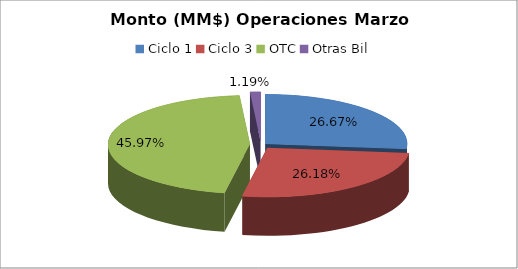
| Category | Series 0 |
|---|---|
| Ciclo 1 | 14378352.11 |
| Ciclo 3 | 14112935.088 |
| OTC | 24782461.824 |
| Otras Bil | 641313.533 |